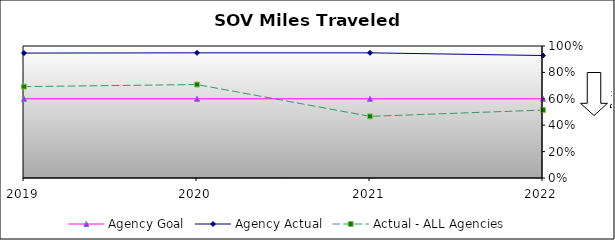
| Category | Agency Goal | Agency Actual | Actual - ALL Agencies |
|---|---|---|---|
| 2019.0 | 0.6 | 0.946 | 0.692 |
| 2020.0 | 0.6 | 0.948 | 0.708 |
| 2021.0 | 0.6 | 0.948 | 0.467 |
| 2022.0 | 0.6 | 0.928 | 0.515 |